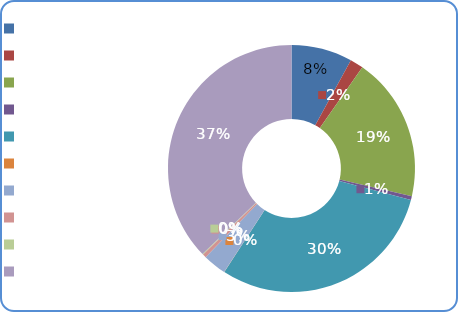
| Category | Расходы |
|---|---|
| Культура | 8429700 |
| Образование | 1839000 |
| Социальная политика | 19937800 |
| Экономика | 530000 |
| ЖКХ | 31735800 |
| Экология | 30000 |
| СМИ | 3230000 |
| Спорт | 500000 |
| Нац.безопасность | 98000 |
| Государственные вопросы | 39270400 |